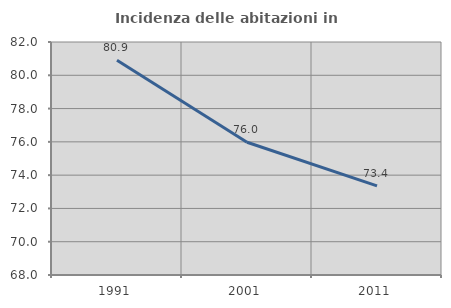
| Category | Incidenza delle abitazioni in proprietà  |
|---|---|
| 1991.0 | 80.9 |
| 2001.0 | 75.976 |
| 2011.0 | 73.353 |